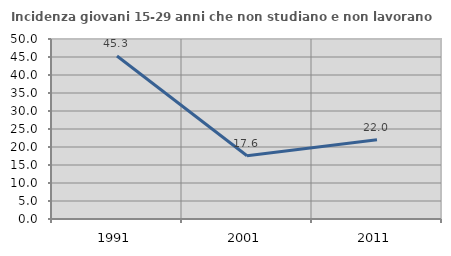
| Category | Incidenza giovani 15-29 anni che non studiano e non lavorano  |
|---|---|
| 1991.0 | 45.28 |
| 2001.0 | 17.584 |
| 2011.0 | 21.987 |